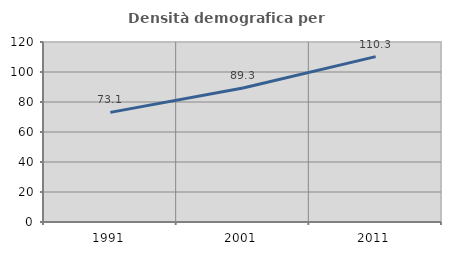
| Category | Densità demografica |
|---|---|
| 1991.0 | 73.081 |
| 2001.0 | 89.333 |
| 2011.0 | 110.271 |